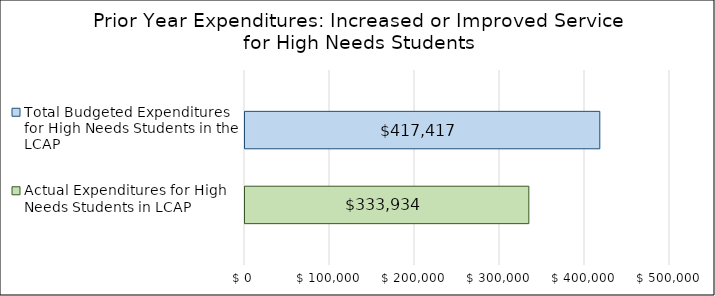
| Category | Actual Expenditures for High Needs Students in LCAP | Total Budgeted Expenditures for High Needs Students in the LCAP |
|---|---|---|
| 0 | 333933.6 | 417417 |